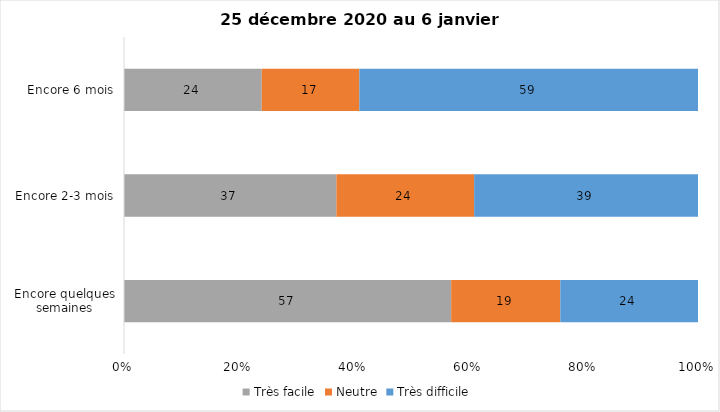
| Category | Très facile | Neutre | Très difficile |
|---|---|---|---|
| Encore quelques semaines | 57 | 19 | 24 |
| Encore 2-3 mois | 37 | 24 | 39 |
| Encore 6 mois | 24 | 17 | 59 |